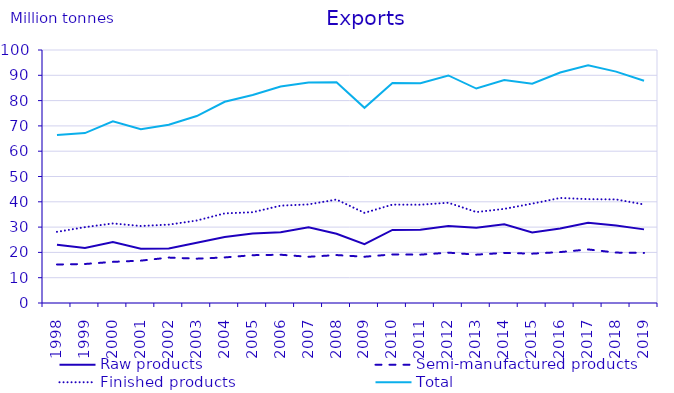
| Category | Raw products | Semi-manufactured products | Finished products | Total |
|---|---|---|---|---|
| 1998.0 | 23.014 | 15.225 | 28.118 | 66.356 |
| 1999.0 | 21.768 | 15.418 | 29.983 | 67.169 |
| 2000.0 | 24.092 | 16.259 | 31.435 | 71.786 |
| 2001.0 | 21.458 | 16.744 | 30.44 | 68.642 |
| 2002.0 | 21.553 | 17.952 | 30.983 | 70.488 |
| 2003.0 | 23.794 | 17.523 | 32.59 | 73.906 |
| 2004.0 | 26.099 | 18.01 | 35.421 | 79.53 |
| 2005.0 | 27.44 | 18.905 | 35.877 | 82.222 |
| 2006.0 | 28.008 | 19.074 | 38.469 | 85.551 |
| 2007.0 | 29.901 | 18.267 | 38.976 | 87.144 |
| 2008.0 | 27.364 | 18.951 | 40.893 | 87.208 |
| 2009.0 | 23.233 | 18.287 | 35.626 | 77.145 |
| 2010.0 | 28.899 | 19.203 | 38.89 | 86.992 |
| 2011.0 | 28.913 | 19.112 | 38.848 | 86.873 |
| 2012.0 | 30.4 | 19.907 | 39.63 | 89.938 |
| 2013.0 | 29.709 | 19.106 | 35.945 | 84.76 |
| 2014.0 | 31.1 | 19.806 | 37.203 | 88.109 |
| 2015.0 | 27.91 | 19.502 | 39.273 | 86.686 |
| 2016.0 | 29.44 | 20.124 | 41.517 | 91.081 |
| 2017.0 | 31.692 | 21.176 | 41.047 | 93.916 |
| 2018.0 | 30.59 | 19.922 | 40.949 | 91.46 |
| 2019.0 | 29.098 | 19.797 | 38.933 | 87.828 |